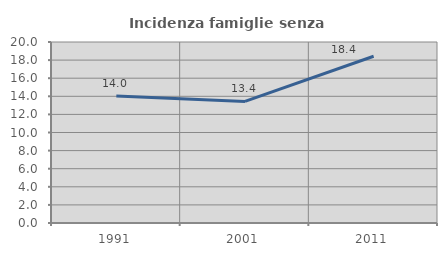
| Category | Incidenza famiglie senza nuclei |
|---|---|
| 1991.0 | 14.034 |
| 2001.0 | 13.431 |
| 2011.0 | 18.423 |